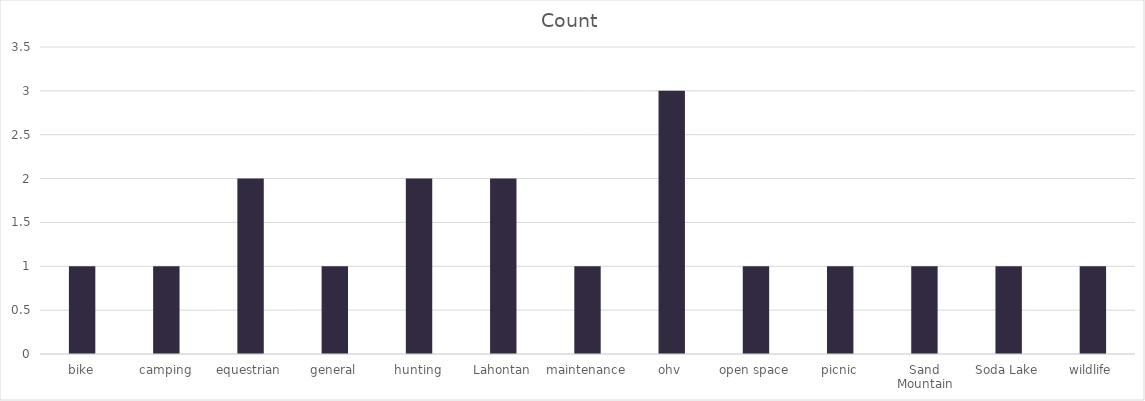
| Category | Count |
|---|---|
| bike | 1 |
| camping | 1 |
| equestrian | 2 |
| general | 1 |
| hunting | 2 |
| Lahontan | 2 |
| maintenance | 1 |
| ohv | 3 |
| open space | 1 |
| picnic | 1 |
| Sand Mountain | 1 |
| Soda Lake | 1 |
| wildlife | 1 |